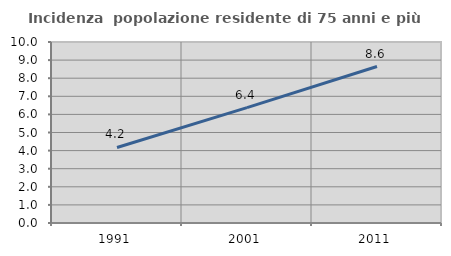
| Category | Incidenza  popolazione residente di 75 anni e più |
|---|---|
| 1991.0 | 4.173 |
| 2001.0 | 6.377 |
| 2011.0 | 8.644 |